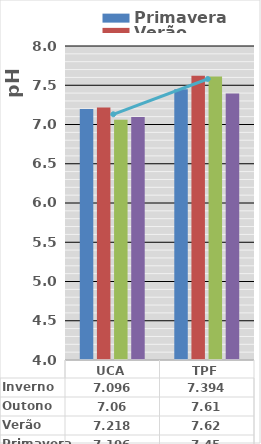
| Category | Primavera | Verão | Outono | Inverno |
|---|---|---|---|---|
| UCA | 7.196 | 7.218 | 7.06 | 7.096 |
| TPF | 7.45 | 7.62 | 7.61 | 7.394 |